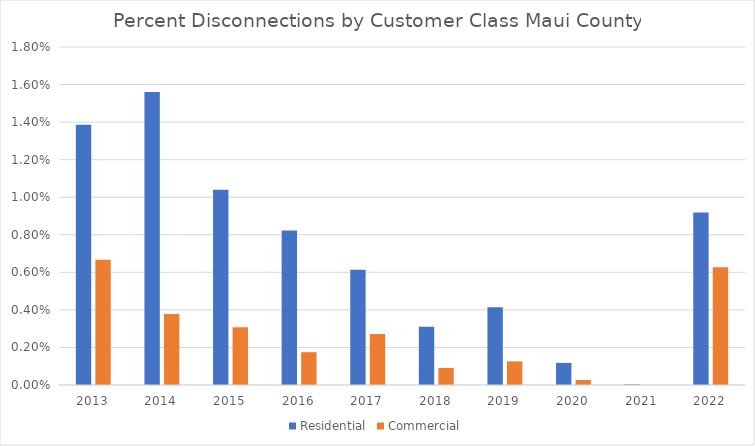
| Category | Residential | Commercial |
|---|---|---|
| 2013.0 | 0.014 | 0.007 |
| 2014.0 | 0.016 | 0.004 |
| 2015.0 | 0.01 | 0.003 |
| 2016.0 | 0.008 | 0.002 |
| 2017.0 | 0.006 | 0.003 |
| 2018.0 | 0.003 | 0.001 |
| 2019.0 | 0.004 | 0.001 |
| 2020.0 | 0.001 | 0 |
| 2021.0 | 0 | 0 |
| 2022.0 | 0.009 | 0.006 |